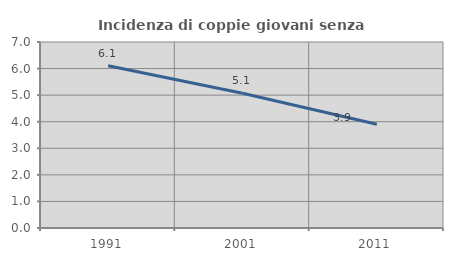
| Category | Incidenza di coppie giovani senza figli |
|---|---|
| 1991.0 | 6.107 |
| 2001.0 | 5.072 |
| 2011.0 | 3.906 |